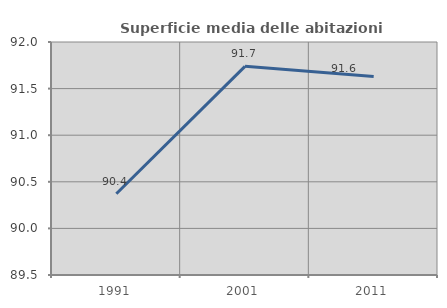
| Category | Superficie media delle abitazioni occupate |
|---|---|
| 1991.0 | 90.372 |
| 2001.0 | 91.739 |
| 2011.0 | 91.631 |